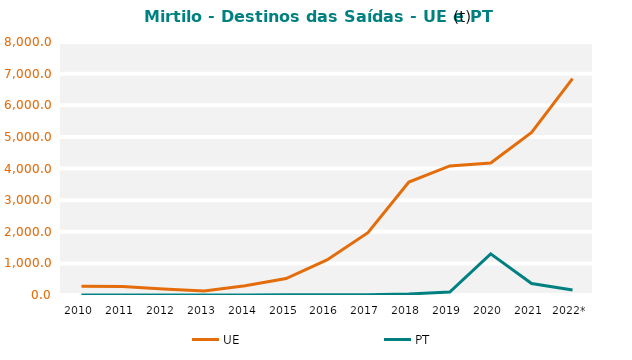
| Category | UE | PT |
|---|---|---|
| 2010 | 274.465 | 0.071 |
| 2011 | 270.429 | 0.188 |
| 2012 | 191.983 | 0.305 |
| 2013 | 126.677 | 0.487 |
| 2014 | 292.456 | 1.365 |
| 2015 | 518.884 | 10.902 |
| 2016 | 1108.768 | 5.061 |
| 2017 | 1969.546 | 11.814 |
| 2018 | 3571.235 | 33.892 |
| 2019 | 4082.829 | 91.734 |
| 2020 | 4172.352 | 1299.977 |
| 2021 | 5138.026 | 362.759 |
| 2022* | 6840.481 | 157.21 |